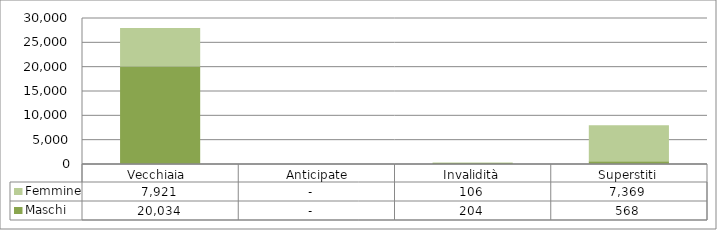
| Category | Maschi | Femmine |
|---|---|---|
| Vecchiaia  | 20034 | 7921 |
|  Anticipate | 0 | 0 |
| Invalidità | 204 | 106 |
| Superstiti | 568 | 7369 |